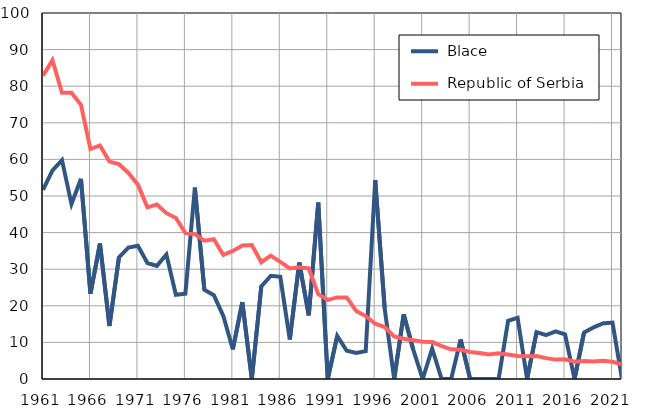
| Category |  Blace |  Republic of Serbia |
|---|---|---|
| 1961.0 | 51.7 | 82.9 |
| 1962.0 | 57 | 87.1 |
| 1963.0 | 59.8 | 78.2 |
| 1964.0 | 47.8 | 78.2 |
| 1965.0 | 54.7 | 74.9 |
| 1966.0 | 23.3 | 62.8 |
| 1967.0 | 37 | 63.8 |
| 1968.0 | 14.5 | 59.4 |
| 1969.0 | 33.2 | 58.7 |
| 1970.0 | 35.9 | 56.3 |
| 1971.0 | 36.4 | 53.1 |
| 1972.0 | 31.7 | 46.9 |
| 1973.0 | 30.9 | 47.7 |
| 1974.0 | 34 | 45.3 |
| 1975.0 | 23 | 44 |
| 1976.0 | 23.3 | 39.9 |
| 1977.0 | 52.3 | 39.6 |
| 1978.0 | 24.4 | 37.8 |
| 1979.0 | 22.9 | 38.2 |
| 1980.0 | 17.2 | 33.9 |
| 1981.0 | 8.1 | 35 |
| 1982.0 | 21 | 36.5 |
| 1983.0 | 0 | 36.6 |
| 1984.0 | 25.3 | 31.9 |
| 1985.0 | 28.2 | 33.7 |
| 1986.0 | 27.9 | 32 |
| 1987.0 | 10.8 | 30.2 |
| 1988.0 | 31.8 | 30.5 |
| 1989.0 | 17.4 | 30.2 |
| 1990.0 | 48.2 | 23.2 |
| 1991.0 | 0 | 21.6 |
| 1992.0 | 11.8 | 22.3 |
| 1993.0 | 7.7 | 22.3 |
| 1994.0 | 7.1 | 18.6 |
| 1995.0 | 7.6 | 17.2 |
| 1996.0 | 54.3 | 15.1 |
| 1997.0 | 19.2 | 14.2 |
| 1998.0 | 0 | 11.6 |
| 1999.0 | 17.7 | 11 |
| 2000.0 | 8.1 | 10.6 |
| 2001.0 | 0 | 10.2 |
| 2002.0 | 8.3 | 10.1 |
| 2003.0 | 0 | 9 |
| 2004.0 | 0 | 8.1 |
| 2005.0 | 10.8 | 8 |
| 2006.0 | 0 | 7.4 |
| 2007.0 | 0 | 7.1 |
| 2008.0 | 0 | 6.7 |
| 2009.0 | 0 | 7 |
| 2010.0 | 15.9 | 6.7 |
| 2011.0 | 16.7 | 6.3 |
| 2012.0 | 0 | 6.2 |
| 2013.0 | 12.8 | 6.3 |
| 2014.0 | 12 | 5.7 |
| 2015.0 | 13 | 5.3 |
| 2016.0 | 12.2 | 5.4 |
| 2017.0 | 0 | 4.7 |
| 2018.0 | 12.7 | 4.9 |
| 2019.0 | 14.1 | 4.8 |
| 2020.0 | 15.2 | 5 |
| 2021.0 | 15.4 | 4.7 |
| 2022.0 | 0 | 4 |